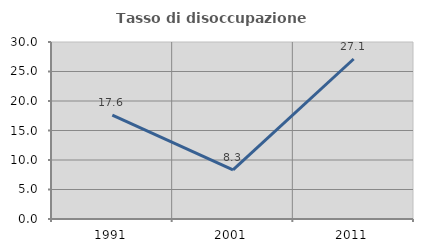
| Category | Tasso di disoccupazione giovanile  |
|---|---|
| 1991.0 | 17.6 |
| 2001.0 | 8.333 |
| 2011.0 | 27.119 |